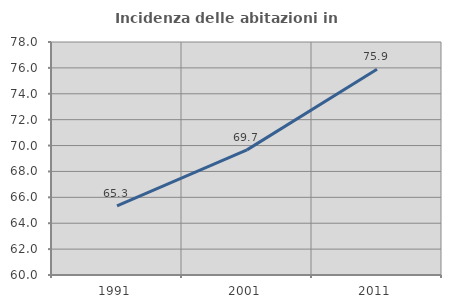
| Category | Incidenza delle abitazioni in proprietà  |
|---|---|
| 1991.0 | 65.331 |
| 2001.0 | 69.665 |
| 2011.0 | 75.888 |